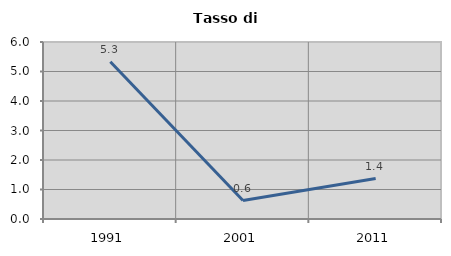
| Category | Tasso di disoccupazione   |
|---|---|
| 1991.0 | 5.333 |
| 2001.0 | 0.625 |
| 2011.0 | 1.37 |